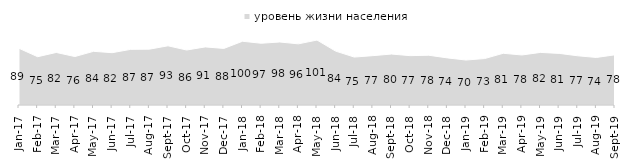
| Category | уровень жизни населения |
|---|---|
| 2017-01-01 | 88.55 |
| 2017-02-01 | 75.45 |
| 2017-03-01 | 82.1 |
| 2017-04-01 | 75.7 |
| 2017-05-01 | 83.85 |
| 2017-06-01 | 81.75 |
| 2017-07-01 | 86.95 |
| 2017-08-01 | 87.25 |
| 2017-09-01 | 92.5 |
| 2017-10-01 | 85.9 |
| 2017-11-01 | 90.75 |
| 2017-12-01 | 88.4 |
| 2018-01-01 | 99.6 |
| 2018-02-01 | 96.5 |
| 2018-03-01 | 98.45 |
| 2018-04-01 | 95.55 |
| 2018-05-01 | 101.45 |
| 2018-06-01 | 84.2 |
| 2018-07-01 | 74.9 |
| 2018-08-01 | 77.1 |
| 2018-09-01 | 79.6 |
| 2018-10-01 | 77.1 |
| 2018-11-01 | 77.745 |
| 2018-12-01 | 73.6 |
| 2019-01-01 | 70.25 |
| 2019-02-01 | 72.55 |
| 2019-03-01 | 80.806 |
| 2019-04-01 | 78.168 |
| 2019-05-01 | 82.169 |
| 2019-06-01 | 80.648 |
| 2019-07-01 | 76.881 |
| 2019-08-01 | 74.276 |
| 2019-09-01 | 78.465 |